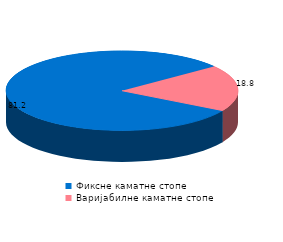
| Category | Series 0 |
|---|---|
| Фиксне каматне стопе | 81.21 |
| Варијабилне каматне стопе | 18.79 |